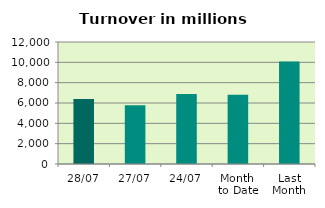
| Category | Series 0 |
|---|---|
| 28/07 | 6402.503 |
| 27/07 | 5790.298 |
| 24/07 | 6896.34 |
| Month 
to Date | 6821.771 |
| Last
Month | 10085.686 |